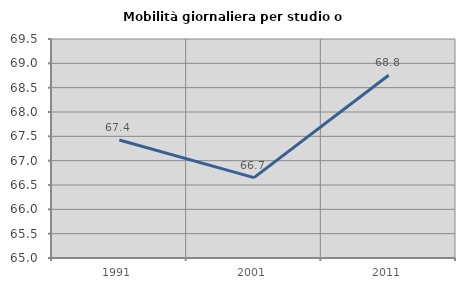
| Category | Mobilità giornaliera per studio o lavoro |
|---|---|
| 1991.0 | 67.424 |
| 2001.0 | 66.651 |
| 2011.0 | 68.754 |